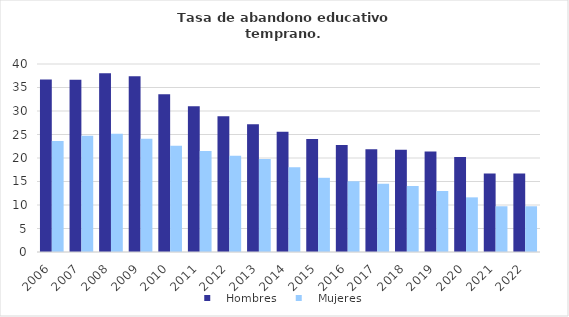
| Category |    Hombres |    Mujeres |
|---|---|---|
| 2006.0 | 36.708 | 23.607 |
| 2007.0 | 36.631 | 24.737 |
| 2008.0 | 38.05 | 25.147 |
| 2009.0 | 37.398 | 24.114 |
| 2010.0 | 33.554 | 22.632 |
| 2011.0 | 31.035 | 21.468 |
| 2012.0 | 28.876 | 20.455 |
| 2013.0 | 27.176 | 19.791 |
| 2014.0 | 25.598 | 18.057 |
| 2015.0 | 24.035 | 15.788 |
| 2016.0 | 22.743 | 15.051 |
| 2017.0 | 21.846 | 14.537 |
| 2018.0 | 21.743 | 14.017 |
| 2019.0 | 21.386 | 12.976 |
| 2020.0 | 20.223 | 11.628 |
| 2021.0 | 16.722 | 9.732 |
| 2022.0 | 16.722 | 9.732 |